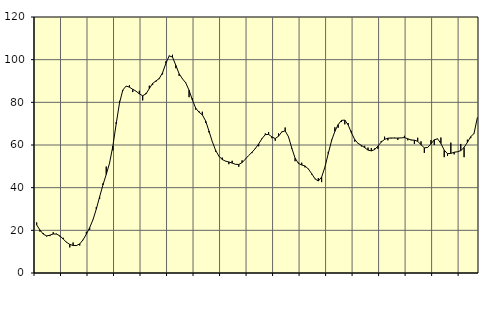
| Category | Piggar | Series 1 |
|---|---|---|
| nan | 23.7 | 22.55 |
| 87.0 | 19.4 | 20.14 |
| 87.0 | 18.7 | 18.22 |
| 87.0 | 17.1 | 17.4 |
| nan | 17.3 | 17.72 |
| 88.0 | 19.1 | 18.3 |
| 88.0 | 18.4 | 18.24 |
| 88.0 | 17.1 | 17.42 |
| nan | 16.5 | 15.93 |
| 89.0 | 14.6 | 14.41 |
| 89.0 | 12 | 13.39 |
| 89.0 | 14.3 | 12.91 |
| nan | 12.7 | 12.88 |
| 90.0 | 12.9 | 13.63 |
| 90.0 | 15.4 | 15.56 |
| 90.0 | 19.3 | 18.2 |
| nan | 20.2 | 21.24 |
| 91.0 | 24.9 | 24.99 |
| 91.0 | 30.9 | 29.95 |
| 91.0 | 34.7 | 35.7 |
| nan | 42 | 41.26 |
| 92.0 | 49.9 | 46.18 |
| 92.0 | 51.5 | 51.53 |
| 92.0 | 57.5 | 59.49 |
| nan | 70.7 | 69.9 |
| 93.0 | 80.7 | 79.64 |
| 93.0 | 85.4 | 85.75 |
| 93.0 | 87.6 | 87.63 |
| nan | 88 | 87.11 |
| 94.0 | 84.8 | 86.11 |
| 94.0 | 85.2 | 85.23 |
| 94.0 | 85.4 | 83.97 |
| nan | 80.9 | 83.08 |
| 95.0 | 84.4 | 83.98 |
| 95.0 | 87.8 | 86.44 |
| 95.0 | 88.1 | 88.86 |
| nan | 89.7 | 90.03 |
| 96.0 | 90.9 | 91.16 |
| 96.0 | 93.1 | 93.89 |
| 96.0 | 99.2 | 98.27 |
| nan | 101.9 | 101.76 |
| 97.0 | 102.3 | 101.25 |
| 97.0 | 96 | 97.34 |
| 97.0 | 92.4 | 93.39 |
| nan | 91.2 | 91.05 |
| 98.0 | 89.3 | 89.11 |
| 98.0 | 82.4 | 85.68 |
| 98.0 | 81.9 | 81.12 |
| nan | 76.6 | 77.28 |
| 99.0 | 75.8 | 75.39 |
| 99.0 | 75.6 | 74.14 |
| 99.0 | 70.3 | 71.28 |
| nan | 65.9 | 66.56 |
| 0.0 | 61.7 | 61.64 |
| 0.0 | 56.9 | 57.53 |
| 0.0 | 54.7 | 54.78 |
| nan | 54.1 | 53.2 |
| 1.0 | 52.4 | 52.45 |
| 1.0 | 51 | 52.05 |
| 1.0 | 52.6 | 51.52 |
| nan | 51 | 50.95 |
| 2.0 | 49.8 | 50.87 |
| 2.0 | 52.8 | 51.75 |
| 2.0 | 53.5 | 53.4 |
| nan | 55.1 | 55.1 |
| 3.0 | 56.2 | 56.61 |
| 3.0 | 58.6 | 58.35 |
| 3.0 | 59.4 | 60.5 |
| nan | 63.2 | 62.99 |
| 4.0 | 65.4 | 64.85 |
| 4.0 | 66.1 | 64.97 |
| 4.0 | 63.2 | 63.8 |
| nan | 62 | 63.02 |
| 5.0 | 65.4 | 64.12 |
| 5.0 | 66.3 | 66.15 |
| 5.0 | 68.2 | 66.63 |
| nan | 63.7 | 63.86 |
| 6.0 | 58.3 | 58.56 |
| 6.0 | 52.4 | 53.82 |
| 6.0 | 51.7 | 51.38 |
| nan | 51.7 | 50.62 |
| 7.0 | 49.5 | 50.18 |
| 7.0 | 48.9 | 48.76 |
| 7.0 | 46.2 | 46.58 |
| nan | 44 | 44.18 |
| 8.0 | 44.5 | 43.1 |
| 8.0 | 42.6 | 44.95 |
| 8.0 | 49.7 | 49.68 |
| nan | 56.8 | 55.94 |
| 9.0 | 62.5 | 62.04 |
| 9.0 | 68.3 | 66.39 |
| 9.0 | 68.1 | 69.58 |
| nan | 70.8 | 71.54 |
| 10.0 | 69.7 | 71.68 |
| 10.0 | 70.3 | 69.46 |
| 10.0 | 66.6 | 65.71 |
| nan | 61.6 | 62.54 |
| 11.0 | 60.6 | 60.76 |
| 11.0 | 59.3 | 59.85 |
| 11.0 | 59.6 | 58.75 |
| nan | 58.8 | 57.61 |
| 12.0 | 58.6 | 57.24 |
| 12.0 | 58.4 | 57.85 |
| 12.0 | 58.2 | 59.51 |
| nan | 61.9 | 61.39 |
| 13.0 | 63.9 | 62.61 |
| 13.0 | 62.2 | 63.18 |
| 13.0 | 63.1 | 63.29 |
| nan | 63.4 | 63.24 |
| 14.0 | 62.4 | 63.26 |
| 14.0 | 63.3 | 63.33 |
| 14.0 | 64.3 | 63.47 |
| nan | 62.2 | 62.94 |
| 15.0 | 62.5 | 62.32 |
| 15.0 | 60.5 | 62.26 |
| 15.0 | 63.4 | 61.74 |
| nan | 61.7 | 60.13 |
| 16.0 | 56.3 | 58.68 |
| 16.0 | 58.9 | 58.85 |
| 16.0 | 62.3 | 60.52 |
| nan | 60 | 62.45 |
| 17.0 | 63 | 62.88 |
| 17.0 | 63.5 | 60.74 |
| 17.0 | 54.3 | 57.57 |
| nan | 54.9 | 55.94 |
| 18.0 | 61.1 | 56.05 |
| 18.0 | 55.6 | 56.61 |
| 18.0 | 56.8 | 56.83 |
| nan | 60.5 | 57.36 |
| 19.0 | 54.3 | 58.87 |
| 19.0 | 62.5 | 61.25 |
| 19.0 | 63.2 | 63.9 |
| nan | 65.5 | 65.36 |
| 20.0 | 72.9 | 72.8 |